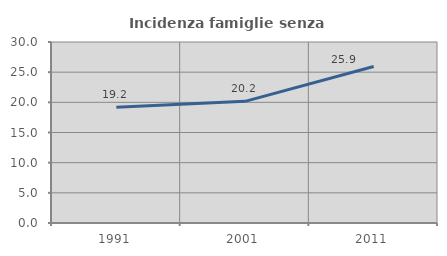
| Category | Incidenza famiglie senza nuclei |
|---|---|
| 1991.0 | 19.169 |
| 2001.0 | 20.16 |
| 2011.0 | 25.937 |